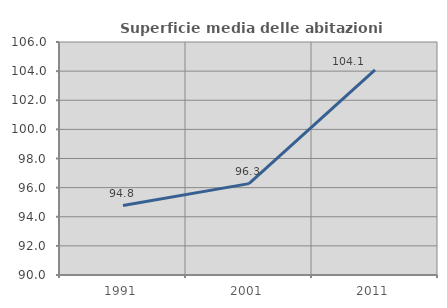
| Category | Superficie media delle abitazioni occupate |
|---|---|
| 1991.0 | 94.766 |
| 2001.0 | 96.275 |
| 2011.0 | 104.08 |